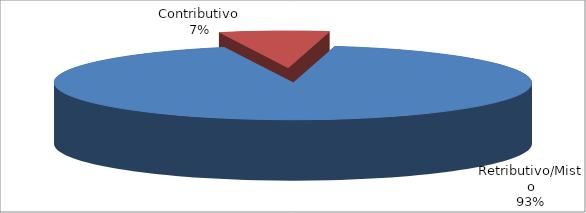
| Category | Series 1 |
|---|---|
| Retributivo/Misto | 223926 |
| Contributivo | 17988 |